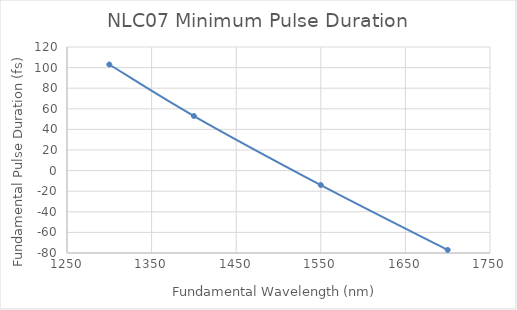
| Category | Fundamental Pulse Duration (fs) |
|---|---|
| 1300.0 | 103 |
| 1400.0 | 53 |
| 1550.0 | -14 |
| 1700.0 | -77 |